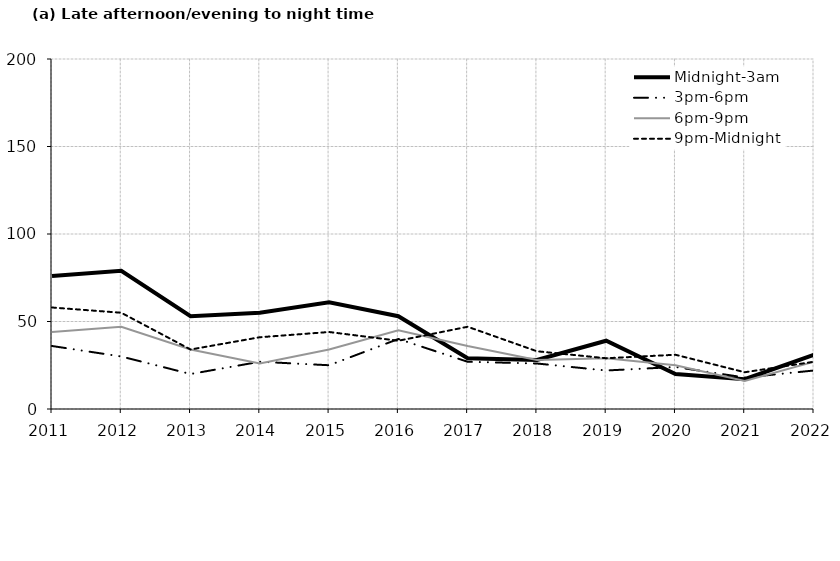
| Category | Midnight-3am | 3pm-6pm | 6pm-9pm | 9pm-Midnight |
|---|---|---|---|---|
| 2011.0 | 76 | 36 | 44 | 58 |
| 2012.0 | 79 | 30 | 47 | 55 |
| 2013.0 | 53 | 20 | 34 | 34 |
| 2014.0 | 55 | 27 | 26 | 41 |
| 2015.0 | 61 | 25 | 34 | 44 |
| 2016.0 | 53 | 40 | 45 | 39 |
| 2017.0 | 29 | 27 | 36 | 47 |
| 2018.0 | 28 | 26 | 28 | 33 |
| 2019.0 | 39 | 22 | 29 | 29 |
| 2020.0 | 20 | 24 | 25 | 31 |
| 2021.0 | 17 | 18 | 16 | 21 |
| 2022.0 | 31 | 22 | 27 | 27 |